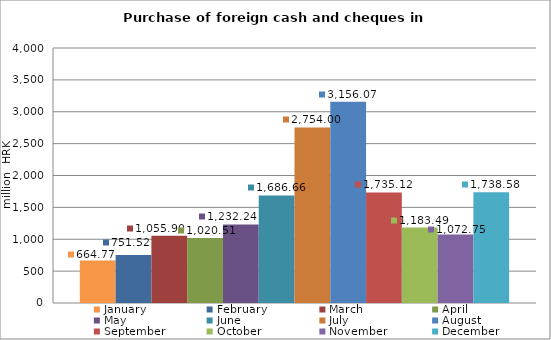
| Category | January | February | March | April | May | June | July | August | September | October | November | December |
|---|---|---|---|---|---|---|---|---|---|---|---|---|
| 0 | 664.77 | 751.521 | 1055.898 | 1020.514 | 1232.237 | 1686.655 | 2754 | 3156.067 | 1735.119 | 1183.495 | 1072.746 | 1738.584 |